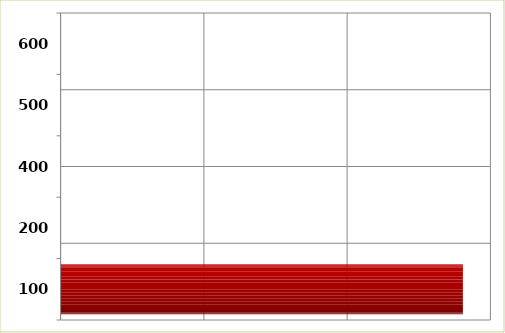
| Category | Series 0 |
|---|---|
| 100.0 | 1404000 |
| 200.0 | 0 |
| 400.0 | 0 |
| 500.0 | 0 |
| 600.0 | 0 |